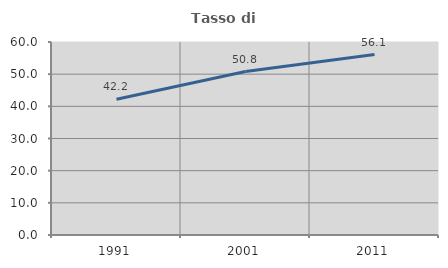
| Category | Tasso di occupazione   |
|---|---|
| 1991.0 | 42.194 |
| 2001.0 | 50.808 |
| 2011.0 | 56.083 |